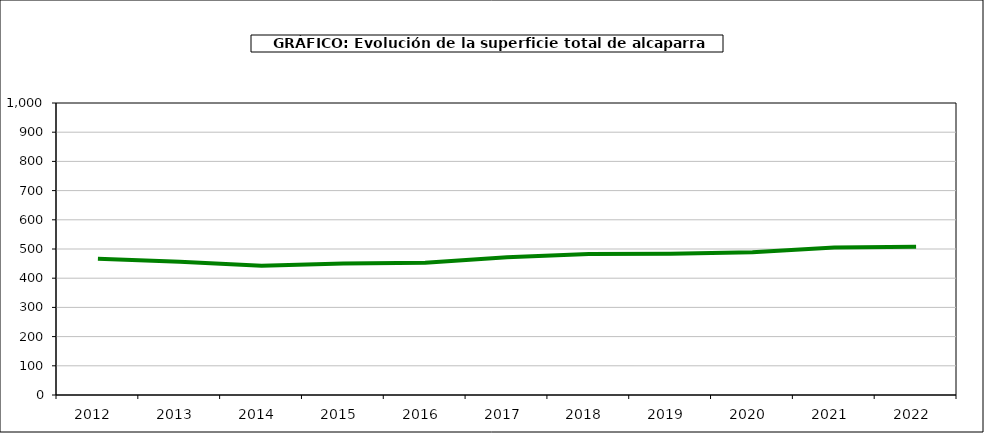
| Category | superficie |
|---|---|
| 2012.0 | 467 |
| 2013.0 | 456 |
| 2014.0 | 443 |
| 2015.0 | 450 |
| 2016.0 | 453 |
| 2017.0 | 472 |
| 2018.0 | 483 |
| 2019.0 | 484 |
| 2020.0 | 489 |
| 2021.0 | 505 |
| 2022.0 | 508 |